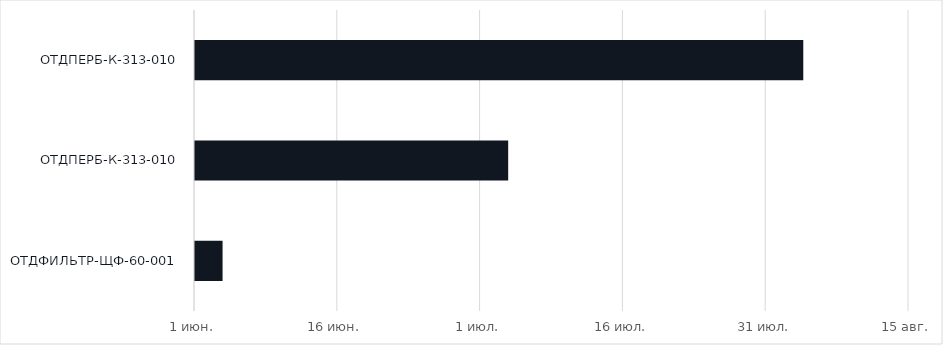
| Category | ДАТА НАЧАЛА | ПЕРИОДИЧНОСТЬ, ДНЕЙ |
|---|---|---|
| инспекция состояния системы | 6/1/22 | 30 |
| чистота поверхности конвейера | 7/1/22 | 15 |
| смазка подшипников | 8/1/22 | 45 |